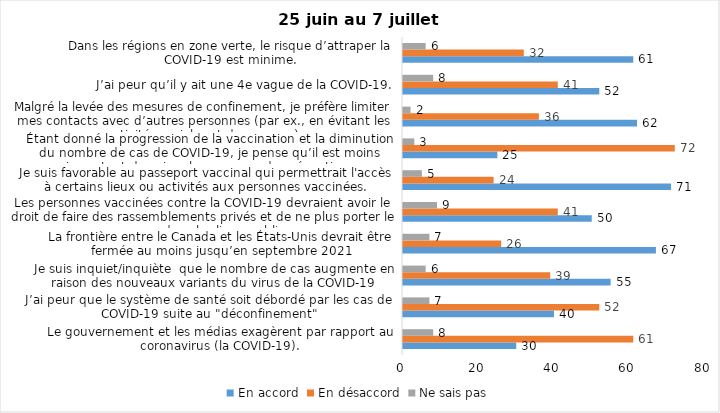
| Category | En accord | En désaccord | Ne sais pas |
|---|---|---|---|
| Le gouvernement et les médias exagèrent par rapport au coronavirus (la COVID-19). | 30 | 61 | 8 |
| J’ai peur que le système de santé soit débordé par les cas de COVID-19 suite au "déconfinement" | 40 | 52 | 7 |
| Je suis inquiet/inquiète  que le nombre de cas augmente en raison des nouveaux variants du virus de la COVID-19 | 55 | 39 | 6 |
| La frontière entre le Canada et les États-Unis devrait être fermée au moins jusqu’en septembre 2021 | 67 | 26 | 7 |
| Les personnes vaccinées contre la COVID-19 devraient avoir le droit de faire des rassemblements privés et de ne plus porter le masque dans les lieux publics. | 50 | 41 | 9 |
| Je suis favorable au passeport vaccinal qui permettrait l'accès à certains lieux ou activités aux personnes vaccinées. | 71 | 24 | 5 |
| Étant donné la progression de la vaccination et la diminution du nombre de cas de COVID-19, je pense qu’il est moins important de suivre les mesures de prévention. | 25 | 72 | 3 |
| Malgré la levée des mesures de confinement, je préfère limiter mes contacts avec d’autres personnes (par ex., en évitant les activités sociales et de groupes) | 62 | 36 | 2 |
| J’ai peur qu’il y ait une 4e vague de la COVID-19. | 52 | 41 | 8 |
| Dans les régions en zone verte, le risque d’attraper la COVID-19 est minime. | 61 | 32 | 6 |